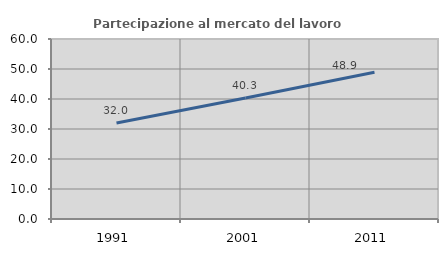
| Category | Partecipazione al mercato del lavoro  femminile |
|---|---|
| 1991.0 | 31.985 |
| 2001.0 | 40.348 |
| 2011.0 | 48.918 |